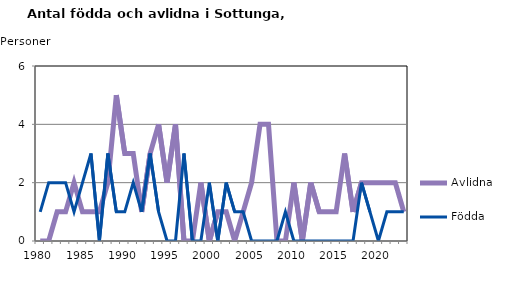
| Category | Avlidna | Födda |
|---|---|---|
| 1980.0 | 0 | 1 |
| 1981.0 | 0 | 2 |
| 1982.0 | 1 | 2 |
| 1983.0 | 1 | 2 |
| 1984.0 | 2 | 1 |
| 1985.0 | 1 | 2 |
| 1986.0 | 1 | 3 |
| 1987.0 | 1 | 0 |
| 1988.0 | 2 | 3 |
| 1989.0 | 5 | 1 |
| 1990.0 | 3 | 1 |
| 1991.0 | 3 | 2 |
| 1992.0 | 1 | 1 |
| 1993.0 | 3 | 3 |
| 1994.0 | 4 | 1 |
| 1995.0 | 2 | 0 |
| 1996.0 | 4 | 0 |
| 1997.0 | 0 | 3 |
| 1998.0 | 0 | 0 |
| 1999.0 | 2 | 0 |
| 2000.0 | 0 | 2 |
| 2001.0 | 1 | 0 |
| 2002.0 | 1 | 2 |
| 2003.0 | 0 | 1 |
| 2004.0 | 1 | 1 |
| 2005.0 | 2 | 0 |
| 2006.0 | 4 | 0 |
| 2007.0 | 4 | 0 |
| 2008.0 | 0 | 0 |
| 2009.0 | 0 | 1 |
| 2010.0 | 2 | 0 |
| 2011.0 | 0 | 0 |
| 2012.0 | 2 | 0 |
| 2013.0 | 1 | 0 |
| 2014.0 | 1 | 0 |
| 2015.0 | 1 | 0 |
| 2016.0 | 3 | 0 |
| 2017.0 | 1 | 0 |
| 2018.0 | 2 | 2 |
| 2019.0 | 2 | 1 |
| 2020.0 | 2 | 0 |
| 2021.0 | 2 | 1 |
| 2022.0 | 2 | 1 |
| 2023.0 | 1 | 1 |